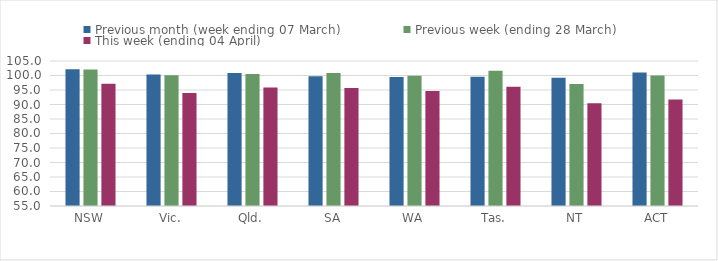
| Category | Previous month (week ending 07 March) | Previous week (ending 28 March) | This week (ending 04 April) |
|---|---|---|---|
| NSW | 102.159 | 102.059 | 97.193 |
| Vic. | 100.305 | 100.105 | 93.977 |
| Qld. | 100.878 | 100.539 | 95.875 |
| SA | 99.756 | 100.846 | 95.692 |
| WA | 99.457 | 99.887 | 94.653 |
| Tas. | 99.548 | 101.628 | 96.095 |
| NT | 99.211 | 97.069 | 90.417 |
| ACT | 101.036 | 100 | 91.71 |